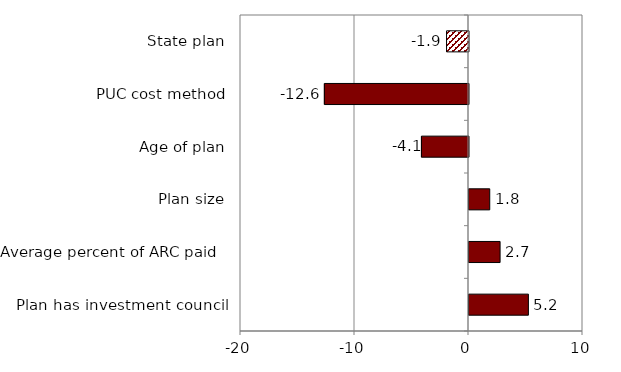
| Category | Series 0 |
|---|---|
| Plan has investment council | 5.21 |
| Average percent of ARC paid   | 2.726 |
| Plan size | 1.82 |
| Age of plan | -4.128 |
| PUC cost method | -12.643 |
| State plan | -1.925 |